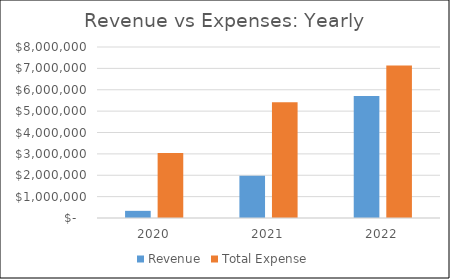
| Category | Revenue | Total Expense |
|---|---|---|
| 2020.0 | 335000 | 3035943.75 |
| 2021.0 | 1973000 | 5417374.062 |
| 2022.0 | 5704000 | 7138936.887 |